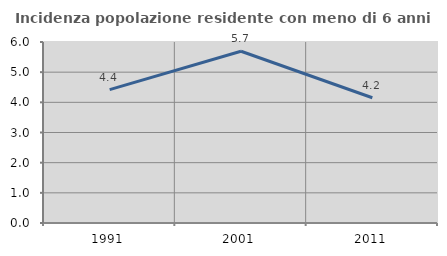
| Category | Incidenza popolazione residente con meno di 6 anni |
|---|---|
| 1991.0 | 4.422 |
| 2001.0 | 5.694 |
| 2011.0 | 4.151 |